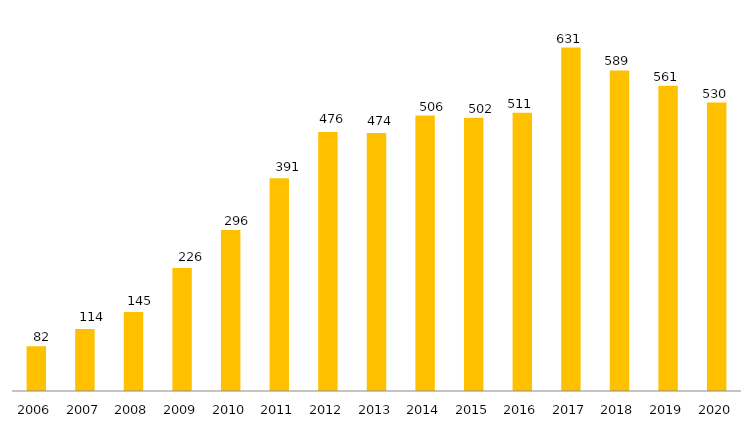
| Category | Programa |
|---|---|
| 2006.0 | 82 |
| 2007.0 | 114 |
| 2008.0 | 145 |
| 2009.0 | 226 |
| 2010.0 | 296 |
| 2011.0 | 391 |
| 2012.0 | 476 |
| 2013.0 | 474 |
| 2014.0 | 506 |
| 2015.0 | 502 |
| 2016.0 | 511 |
| 2017.0 | 631 |
| 2018.0 | 589 |
| 2019.0 | 561 |
| 2020.0 | 530 |